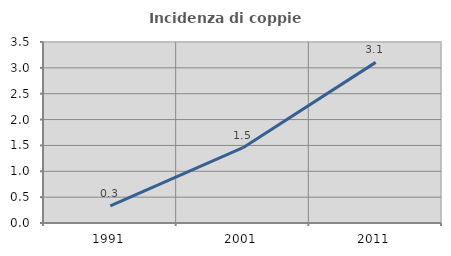
| Category | Incidenza di coppie miste |
|---|---|
| 1991.0 | 0.333 |
| 2001.0 | 1.457 |
| 2011.0 | 3.106 |